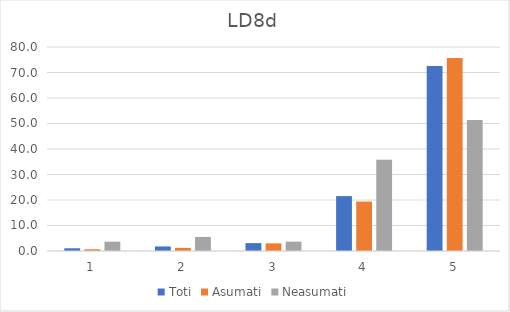
| Category | Toti | Asumati | Neasumati |
|---|---|---|---|
| 0 | 1.07 | 0.683 | 3.67 |
| 1 | 1.784 | 1.23 | 5.505 |
| 2 | 3.092 | 3.005 | 3.67 |
| 3 | 21.522 | 19.399 | 35.78 |
| 4 | 72.533 | 75.683 | 51.376 |